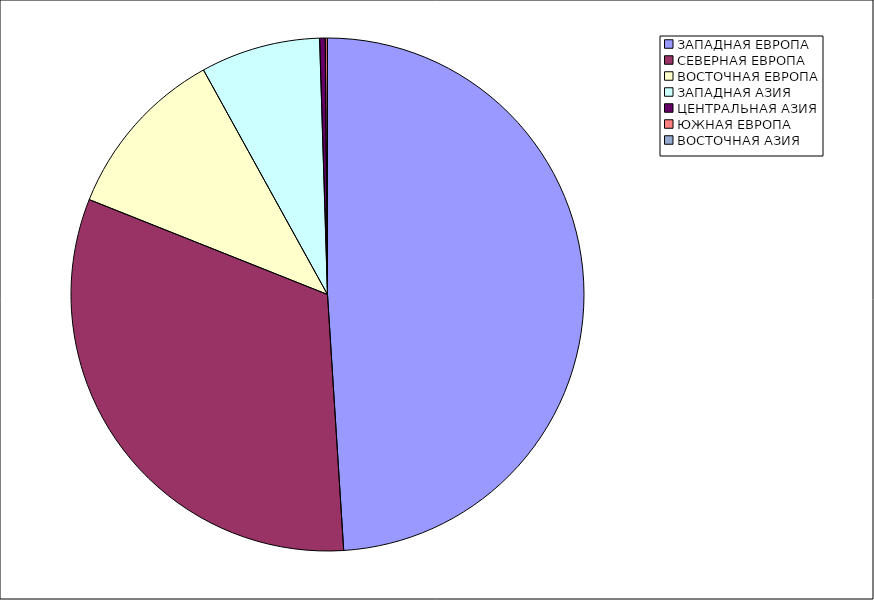
| Category | Оборот |
|---|---|
| ЗАПАДНАЯ ЕВРОПА | 48.992 |
| СЕВЕРНАЯ ЕВРОПА | 32.041 |
| ВОСТОЧНАЯ ЕВРОПА | 10.934 |
| ЗАПАДНАЯ АЗИЯ | 7.543 |
| ЦЕНТРАЛЬНАЯ АЗИЯ | 0.35 |
| ЮЖНАЯ ЕВРОПА | 0.134 |
| ВОСТОЧНАЯ АЗИЯ | 0.007 |